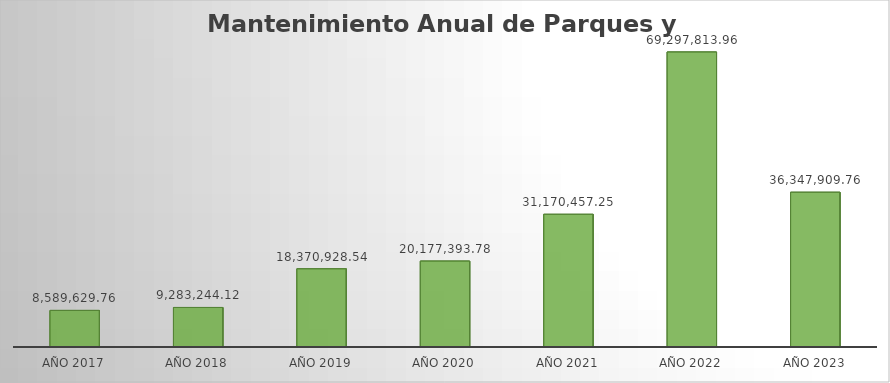
| Category | Suma |
|---|---|
| AÑO 2017 | 8589629.76 |
| AÑO 2018 | 9283244.12 |
| AÑO 2019 | 18370928.54 |
| AÑO 2020 | 20177393.78 |
| AÑO 2021 | 31170457.25 |
| AÑO 2022 | 69297813.96 |
| AÑO 2023 | 36347909.76 |